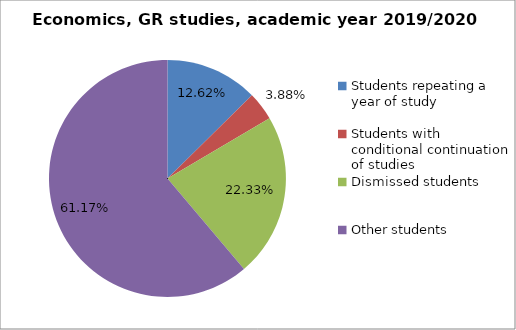
| Category | Series 0 |
|---|---|
| Students repeating a year of study | 13 |
| Students with conditional continuation of studies | 4 |
| Dismissed students | 23 |
| Other students | 63 |